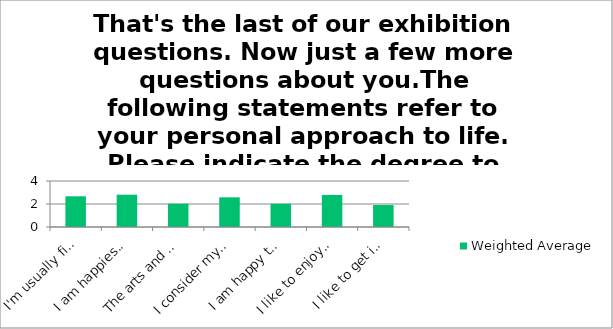
| Category | Weighted Average |
|---|---|
| I'm usually first amongst my friends to know what's going on | 2.67 |
| I am happiest seeing things that have a track record and proven popularity | 2.81 |
| The arts and culture are essential to my life | 2.02 |
| I consider myself to be a spiritual person | 2.58 |
| I am happy to do my own thing regardless of what others might think | 2.02 |
| I like to enjoy life and don't worry about the future | 2.79 |
| I like to get in to the outdoors whenever I can | 1.91 |